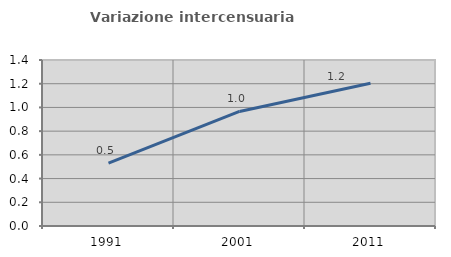
| Category | Variazione intercensuaria annua |
|---|---|
| 1991.0 | 0.53 |
| 2001.0 | 0.966 |
| 2011.0 | 1.204 |